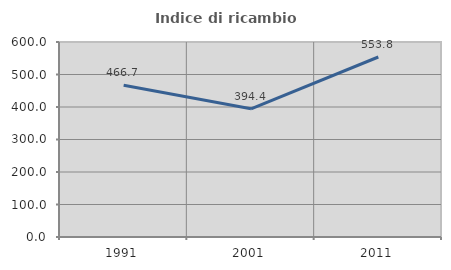
| Category | Indice di ricambio occupazionale  |
|---|---|
| 1991.0 | 466.667 |
| 2001.0 | 394.444 |
| 2011.0 | 553.846 |